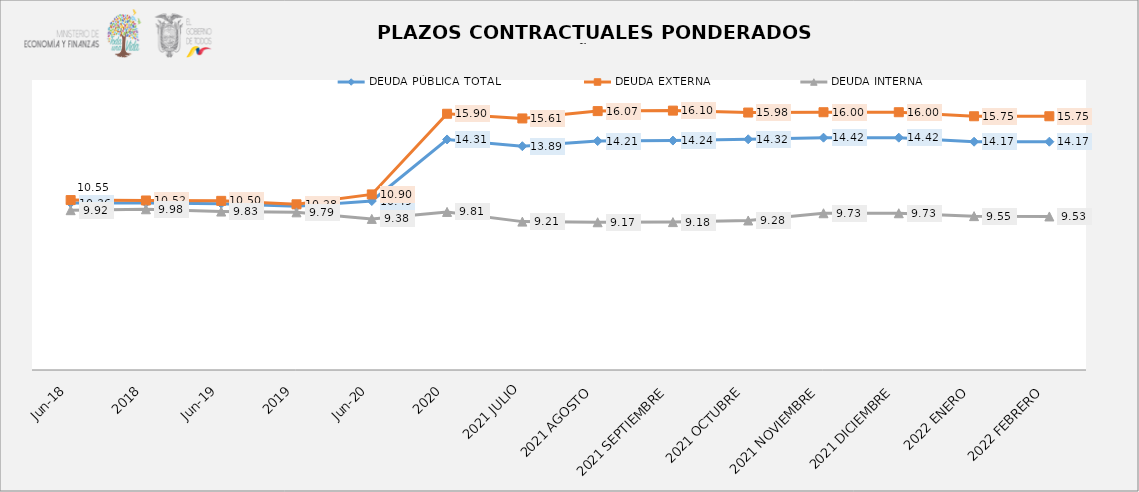
| Category | DEUDA PÚBLICA TOTAL | DEUDA EXTERNA  | DEUDA INTERNA |
|---|---|---|---|
| jun-18 | 10.364 | 10.547 | 9.919 |
| 2018 | 10.371 | 10.522 | 9.976 |
| jun-19 | 10.321 | 10.498 | 9.835 |
| 2019 | 10.156 | 10.284 | 9.786 |
| jun-20 | 10.488 | 10.898 | 9.379 |
| 2020 | 14.309 | 15.905 | 9.812 |
| 2021 JULIO | 13.89 | 15.614 | 9.21 |
| 2021 AGOSTO | 14.21 | 16.07 | 9.17 |
| 2021 SEPTIEMBRE | 14.24 | 16.1 | 9.18 |
| 2021 OCTUBRE | 14.32 | 15.98 | 9.28 |
| 2021 NOVIEMBRE | 14.42 | 16 | 9.73 |
| 2021 DICIEMBRE | 14.42 | 16 | 9.73 |
| 2022 ENERO | 14.17 | 15.75 | 9.55 |
| 2022 FEBRERO | 14.17 | 15.75 | 9.53 |